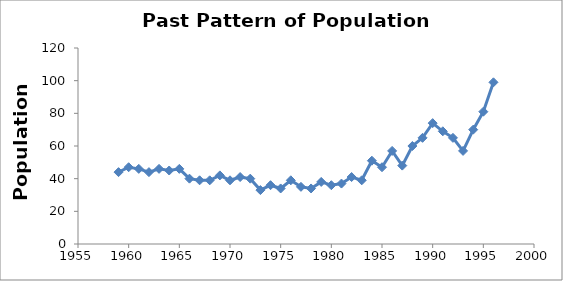
| Category | YNP Grizzlies |
|---|---|
| 1959.0 | 44 |
| 1960.0 | 47 |
| 1961.0 | 46 |
| 1962.0 | 44 |
| 1963.0 | 46 |
| 1964.0 | 45 |
| 1965.0 | 46 |
| 1966.0 | 40 |
| 1967.0 | 39 |
| 1968.0 | 39 |
| 1969.0 | 42 |
| 1970.0 | 39 |
| 1971.0 | 41 |
| 1972.0 | 40 |
| 1973.0 | 33 |
| 1974.0 | 36 |
| 1975.0 | 34 |
| 1976.0 | 39 |
| 1977.0 | 35 |
| 1978.0 | 34 |
| 1979.0 | 38 |
| 1980.0 | 36 |
| 1981.0 | 37 |
| 1982.0 | 41 |
| 1983.0 | 39 |
| 1984.0 | 51 |
| 1985.0 | 47 |
| 1986.0 | 57 |
| 1987.0 | 48 |
| 1988.0 | 60 |
| 1989.0 | 65 |
| 1990.0 | 74 |
| 1991.0 | 69 |
| 1992.0 | 65 |
| 1993.0 | 57 |
| 1994.0 | 70 |
| 1995.0 | 81 |
| 1996.0 | 99 |